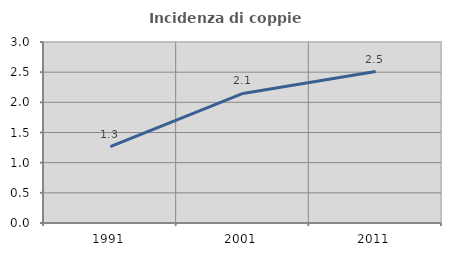
| Category | Incidenza di coppie miste |
|---|---|
| 1991.0 | 1.266 |
| 2001.0 | 2.148 |
| 2011.0 | 2.51 |